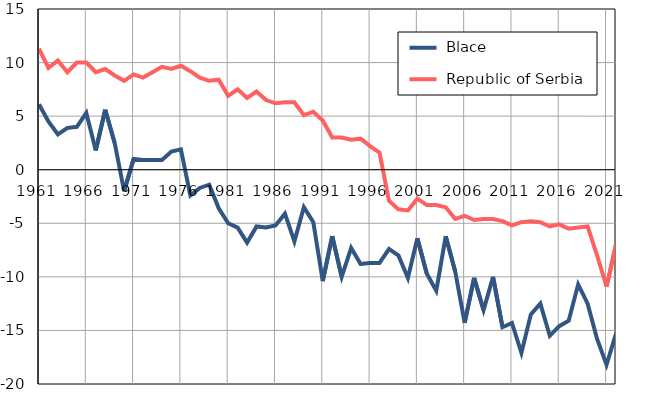
| Category |  Blace |  Republic of Serbia |
|---|---|---|
| 1961.0 | 6.1 | 11.3 |
| 1962.0 | 4.5 | 9.5 |
| 1963.0 | 3.3 | 10.2 |
| 1964.0 | 3.9 | 9.1 |
| 1965.0 | 4 | 10 |
| 1966.0 | 5.3 | 10 |
| 1967.0 | 1.8 | 9.1 |
| 1968.0 | 5.6 | 9.4 |
| 1969.0 | 2.5 | 8.8 |
| 1970.0 | -2 | 8.3 |
| 1971.0 | 1 | 8.9 |
| 1972.0 | 0.9 | 8.6 |
| 1973.0 | 0.9 | 9.1 |
| 1974.0 | 0.9 | 9.6 |
| 1975.0 | 1.7 | 9.4 |
| 1976.0 | 1.9 | 9.7 |
| 1977.0 | -2.4 | 9.2 |
| 1978.0 | -1.7 | 8.6 |
| 1979.0 | -1.4 | 8.3 |
| 1980.0 | -3.6 | 8.4 |
| 1981.0 | -5 | 6.9 |
| 1982.0 | -5.4 | 7.5 |
| 1983.0 | -6.8 | 6.7 |
| 1984.0 | -5.3 | 7.3 |
| 1985.0 | -5.4 | 6.5 |
| 1986.0 | -5.2 | 6.2 |
| 1987.0 | -4.1 | 6.3 |
| 1988.0 | -6.7 | 6.3 |
| 1989.0 | -3.5 | 5.1 |
| 1990.0 | -4.9 | 5.4 |
| 1991.0 | -10.4 | 4.6 |
| 1992.0 | -6.2 | 3 |
| 1993.0 | -10 | 3 |
| 1994.0 | -7.3 | 2.8 |
| 1995.0 | -8.8 | 2.9 |
| 1996.0 | -8.7 | 2.2 |
| 1997.0 | -8.7 | 1.6 |
| 1998.0 | -7.4 | -2.9 |
| 1999.0 | -8 | -3.7 |
| 2000.0 | -10.1 | -3.8 |
| 2001.0 | -6.4 | -2.7 |
| 2002.0 | -9.7 | -3.3 |
| 2003.0 | -11.3 | -3.3 |
| 2004.0 | -6.2 | -3.5 |
| 2005.0 | -9.5 | -4.6 |
| 2006.0 | -14.3 | -4.3 |
| 2007.0 | -10.1 | -4.7 |
| 2008.0 | -13.1 | -4.6 |
| 2009.0 | -10 | -4.6 |
| 2010.0 | -14.7 | -4.8 |
| 2011.0 | -14.3 | -5.2 |
| 2012.0 | -17.1 | -4.9 |
| 2013.0 | -13.5 | -4.8 |
| 2014.0 | -12.5 | -4.9 |
| 2015.0 | -15.5 | -5.3 |
| 2016.0 | -14.6 | -5.1 |
| 2017.0 | -14.1 | -5.5 |
| 2018.0 | -10.7 | -5.4 |
| 2019.0 | -12.5 | -5.3 |
| 2020.0 | -15.8 | -8 |
| 2021.0 | -18.2 | -10.9 |
| 2022.0 | -15.3 | -7 |